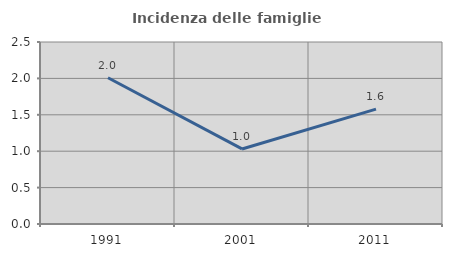
| Category | Incidenza delle famiglie numerose |
|---|---|
| 1991.0 | 2.009 |
| 2001.0 | 1.031 |
| 2011.0 | 1.578 |